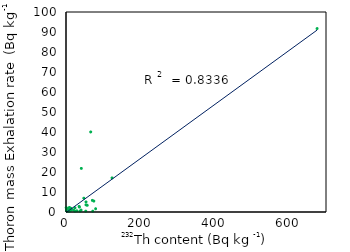
| Category | Series 0 |
|---|---|
| 12.5 | 1.659 |
| 11.75 | 1.948 |
| 9.5 | 1.626 |
| 13.25 | 1.779 |
| 3.8499999999999996 | 1.019 |
| 24.1 | 2.103 |
| 6.4 | 0.528 |
| 35.3 | 2.794 |
| 9.04 | 2.265 |
| 4.1 | 0.753 |
| 9.6 | 0.484 |
| 12.3 | 0.983 |
| 14.35 | 1.492 |
| 13.8 | 1.021 |
| 1.85 | 0.917 |
| 3.9 | 1.053 |
| 75.0 | 5.442 |
| 70.9 | 5.823 |
| 48.0 | 6.904 |
| 10.1 | 0.724 |
| 40.5 | 0.967 |
| 66.5 | 40.025 |
| 36.1 | 2.471 |
| 20.3 | 0.961 |
| 57.1 | 3.361 |
| 53.9 | 5.054 |
| 124.0 | 17.051 |
| 79.7 | 1.622 |
| 53.15 | 0.421 |
| 3.1 | 0.43 |
| 37.5 | 0.433 |
| 72.1 | 0.412 |
| 24.2 | 0.422 |
| 29.3 | 0.61 |
| 41.25 | 21.799 |
| 53.8 | 3.592 |
| 0.6 | 2.175 |
| 1.6 | 1.914 |
| 676.0 | 91.729 |
| 1.1 | 0.813 |
| 1.4 | 0.701 |